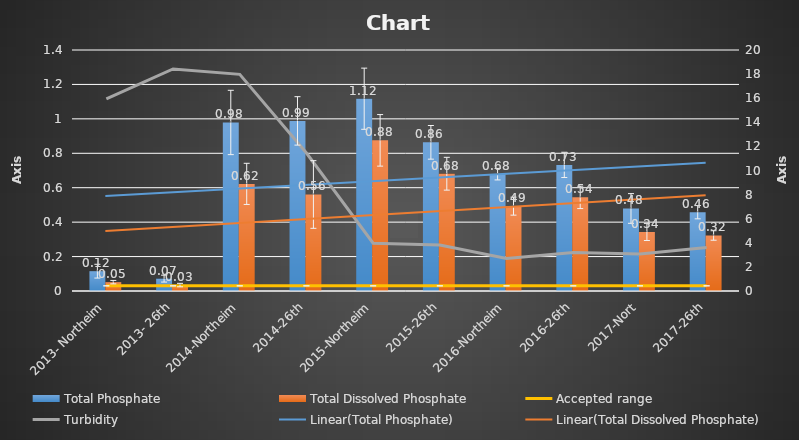
| Category | Total Phosphate | Total Dissolved Phosphate |
|---|---|---|
| 2013- Northeim | 0.115 | 0.051 |
| 2013- 26th | 0.072 | 0.034 |
| 2014-Northeim | 0.979 | 0.622 |
| 2014-26th | 0.988 | 0.561 |
| 2015-Northeim | 1.117 | 0.875 |
| 2015-26th | 0.864 | 0.681 |
| 2016-Northeim | 0.679 | 0.493 |
| 2016-26th | 0.733 | 0.544 |
| 2017-Nort | 0.479 | 0.343 |
| 2017-26th | 0.458 | 0.323 |